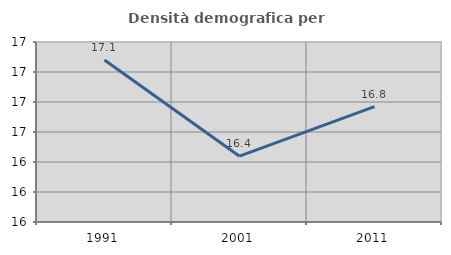
| Category | Densità demografica |
|---|---|
| 1991.0 | 17.08 |
| 2001.0 | 16.439 |
| 2011.0 | 16.77 |